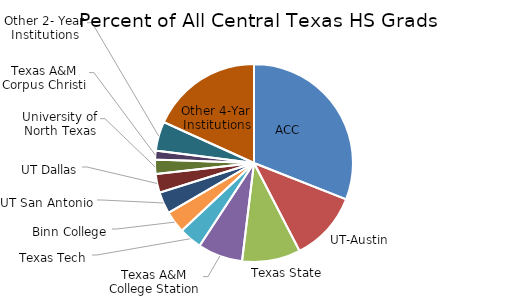
| Category | Percent of All |
|---|---|
| ACC | 0.31 |
| UT-Austin | 0.114 |
| Texas State | 0.095 |
| Texas A&M College Station | 0.073 |
| Texas Tech | 0.038 |
| Binn College | 0.036 |
| UT San Antonio | 0.036 |
| UT Dallas | 0.03 |
| University of North Texas | 0.023 |
| Texas A&M Corpus Christi | 0.015 |
| Other 2- Year Institutions | 0.048 |
| Other 4-Yar Institutions | 0.182 |